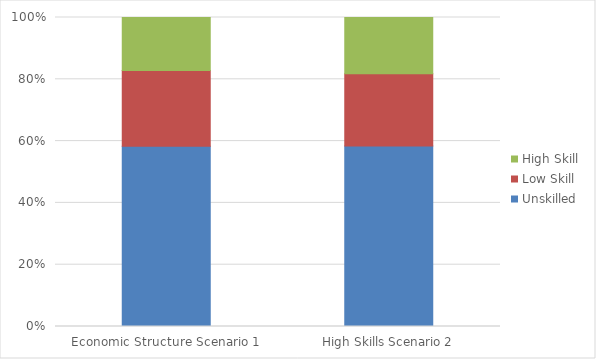
| Category | Unskilled | Low Skill | High Skill |
|---|---|---|---|
| Economic Structure Scenario 1 | 0.583 | 0.245 | 0.172 |
| High Skills Scenario 2 | 0.584 | 0.233 | 0.182 |